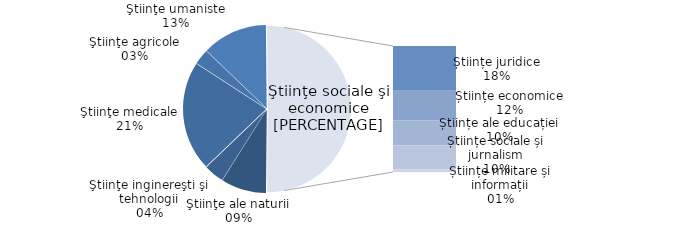
| Category | Series 0 |
|---|---|
| Ştiinţe ale naturii | 8.8 |
| Ştiinţe inginereşti şi tehnologii | 3.9 |
| Ştiinţe medicale | 21.3 |
| Ştiinţe agricole | 3 |
| Ştiinţe umaniste | 12.7 |
| Științe juridice | 17.9 |
| Științe economice | 11.8 |
| Științe ale educației | 10 |
| Științe sociale și jurnalism | 9.5 |
| Științe militare și informații | 1.1 |